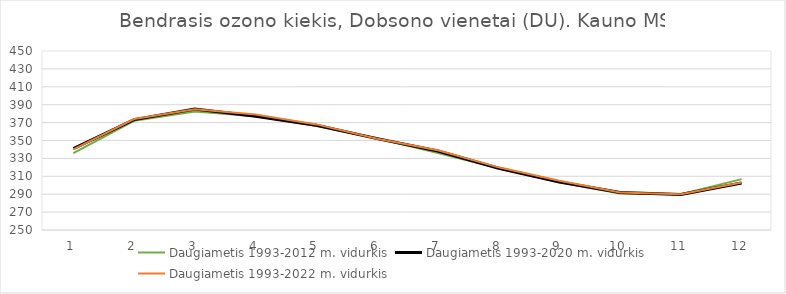
| Category | Daugiametis 1993-2012 m. vidurkis | Daugiametis 1993-2020 m. vidurkis | Daugiametis 1993-2022 m. vidurkis |
|---|---|---|---|
| 0 | 335.818 | 340.894 | 340 |
| 1 | 371.997 | 373.341 | 374 |
| 2 | 382.397 | 385.177 | 385 |
| 3 | 377.028 | 377.047 | 379 |
| 4 | 366.096 | 366.966 | 368 |
| 5 | 352.534 | 352.092 | 352 |
| 6 | 335.985 | 338.283 | 339 |
| 7 | 318.896 | 318.94 | 320 |
| 8 | 303.269 | 303.659 | 305 |
| 9 | 290.827 | 291.905 | 292 |
| 10 | 289.905 | 289.681 | 290 |
| 11 | 306.826 | 302.559 | 303 |